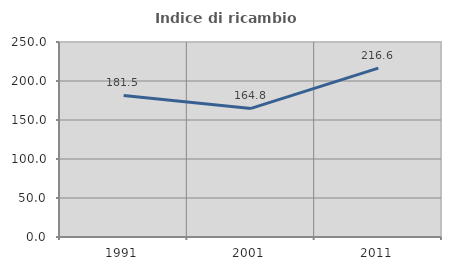
| Category | Indice di ricambio occupazionale  |
|---|---|
| 1991.0 | 181.532 |
| 2001.0 | 164.835 |
| 2011.0 | 216.552 |